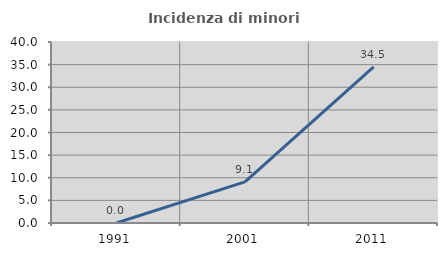
| Category | Incidenza di minori stranieri |
|---|---|
| 1991.0 | 0 |
| 2001.0 | 9.091 |
| 2011.0 | 34.524 |